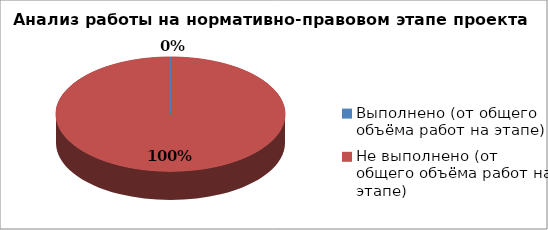
| Category | Series 0 |
|---|---|
| Выполнено (от общего объёма работ на этапе) | 0 |
| Не выполнено (от общего объёма работ на этапе) | 1 |